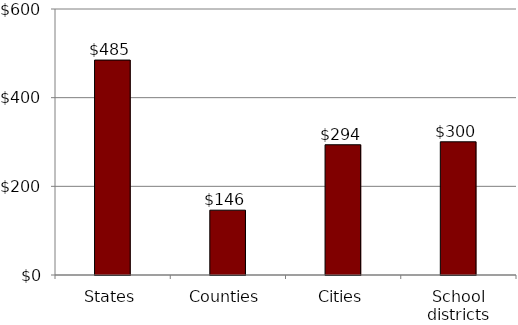
| Category | Series 1 |
|---|---|
| States | 484802545.385 |
| Counties | 146223207.612 |
| Cities | 293796746.2 |
| School districts | 300452795.094 |